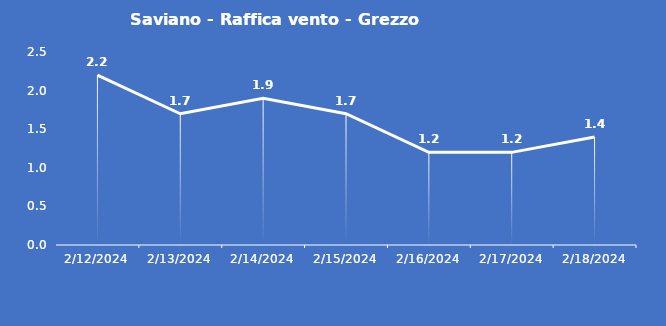
| Category | Saviano - Raffica vento - Grezzo (m/s) |
|---|---|
| 2/12/24 | 2.2 |
| 2/13/24 | 1.7 |
| 2/14/24 | 1.9 |
| 2/15/24 | 1.7 |
| 2/16/24 | 1.2 |
| 2/17/24 | 1.2 |
| 2/18/24 | 1.4 |